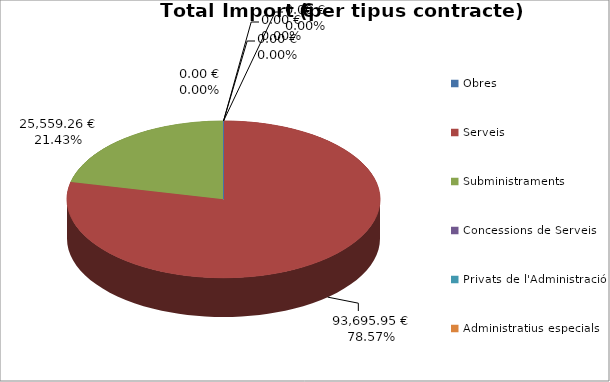
| Category | Total preu              (amb iva) |
|---|---|
| Obres | 0 |
| Serveis | 93695.95 |
| Subministraments | 25559.26 |
| Concessions de Serveis | 0 |
| Privats de l'Administració | 0 |
| Administratius especials | 0 |